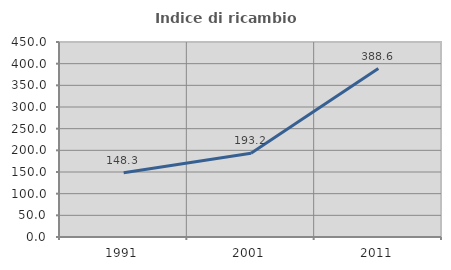
| Category | Indice di ricambio occupazionale  |
|---|---|
| 1991.0 | 148.276 |
| 2001.0 | 193.182 |
| 2011.0 | 388.571 |